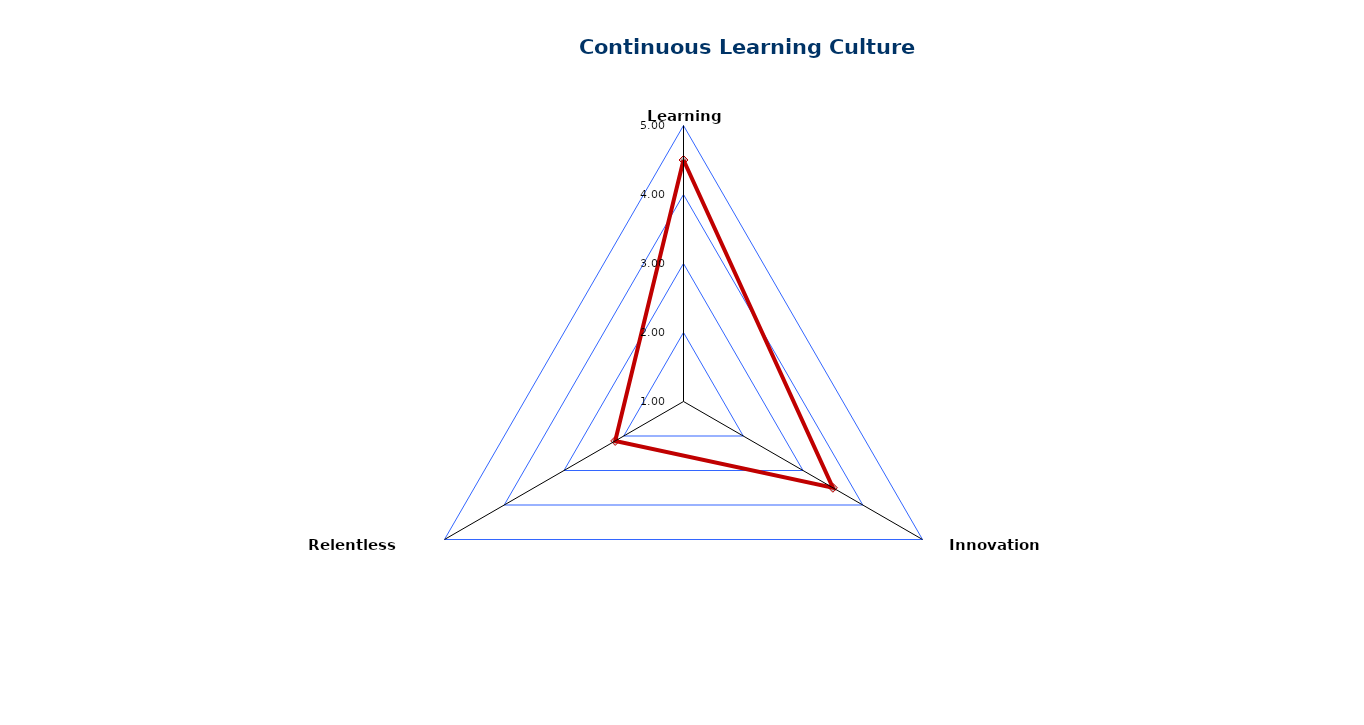
| Category | Continuous Learning Culture |
|---|---|
| Learning Organization | 4.5 |
| Innovation Culture | 3.5 |
| Relentless Improvement | 2.143 |